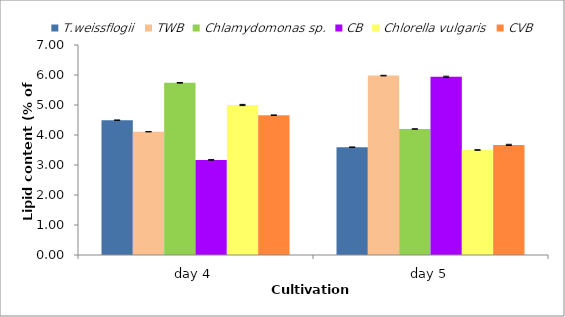
| Category | T.weissflogii | TWB | Chlamydomonas sp. | CB | Chlorella vulgaris | CVB |
|---|---|---|---|---|---|---|
| day 4 | 4.49 | 4.11 | 5.74 | 3.17 | 5 | 4.66 |
| day 5 | 3.59 | 5.98 | 4.2 | 5.94 | 3.5 | 3.67 |